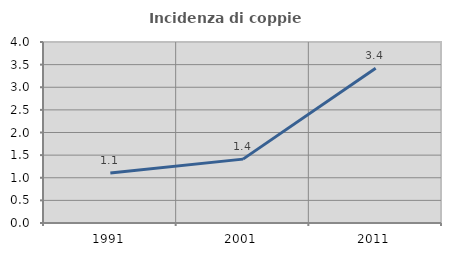
| Category | Incidenza di coppie miste |
|---|---|
| 1991.0 | 1.104 |
| 2001.0 | 1.412 |
| 2011.0 | 3.42 |